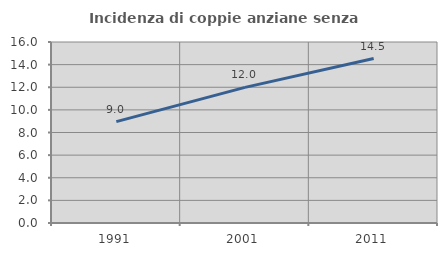
| Category | Incidenza di coppie anziane senza figli  |
|---|---|
| 1991.0 | 8.96 |
| 2001.0 | 11.987 |
| 2011.0 | 14.536 |